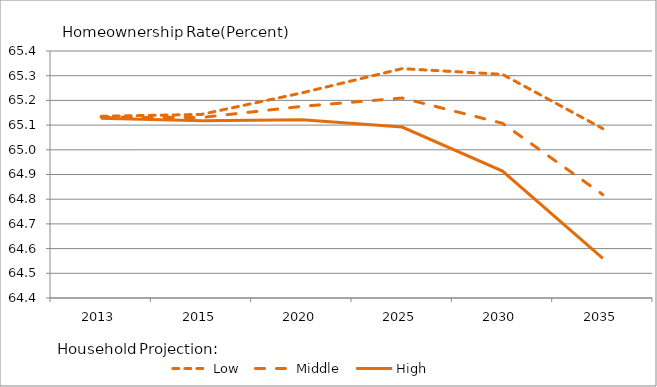
| Category | Low | Middle | High |
|---|---|---|---|
| 2013.0 | 65.135 | 65.132 | 65.128 |
| 2015.0 | 65.143 | 65.131 | 65.118 |
| 2020.0 | 65.23 | 65.176 | 65.122 |
| 2025.0 | 65.329 | 65.21 | 65.092 |
| 2030.0 | 65.305 | 65.107 | 64.914 |
| 2035.0 | 65.086 | 64.819 | 64.56 |